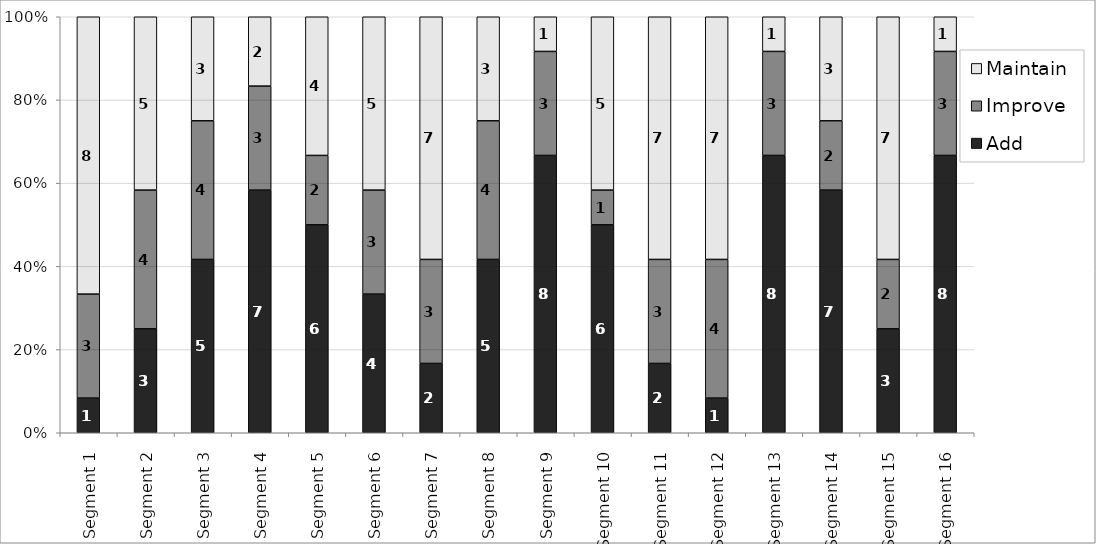
| Category | Add | Improve | Maintain |
|---|---|---|---|
| Segment 1 | 1 | 3 | 8 |
| Segment 2 | 3 | 4 | 5 |
| Segment 3 | 5 | 4 | 3 |
| Segment 4 | 7 | 3 | 2 |
| Segment 5 | 6 | 2 | 4 |
| Segment 6 | 4 | 3 | 5 |
| Segment 7 | 2 | 3 | 7 |
| Segment 8 | 5 | 4 | 3 |
| Segment 9 | 8 | 3 | 1 |
| Segment 10 | 6 | 1 | 5 |
| Segment 11 | 2 | 3 | 7 |
| Segment 12 | 1 | 4 | 7 |
| Segment 13 | 8 | 3 | 1 |
| Segment 14 | 7 | 2 | 3 |
| Segment 15 | 3 | 2 | 7 |
| Segment 16 | 8 | 3 | 1 |